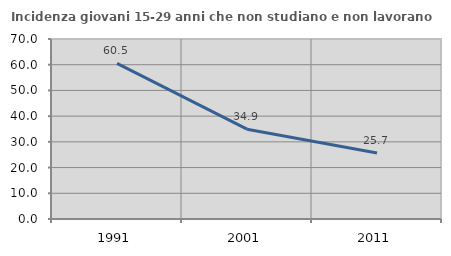
| Category | Incidenza giovani 15-29 anni che non studiano e non lavorano  |
|---|---|
| 1991.0 | 60.507 |
| 2001.0 | 34.924 |
| 2011.0 | 25.651 |